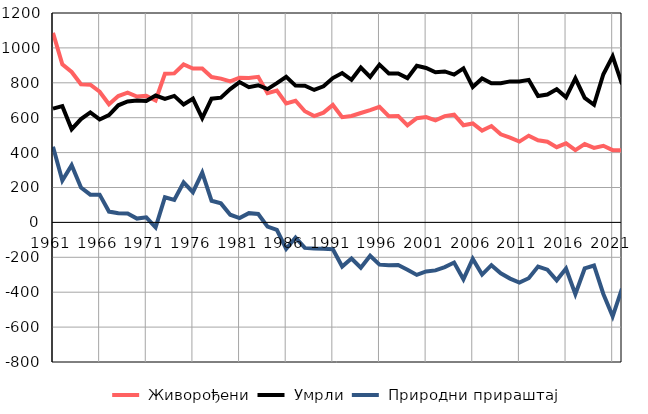
| Category |  Живорођени |  Умрли |  Природни прираштај |
|---|---|---|---|
| 1961.0 | 1086 | 652 | 434 |
| 1962.0 | 906 | 666 | 240 |
| 1963.0 | 862 | 534 | 328 |
| 1964.0 | 792 | 592 | 200 |
| 1965.0 | 789 | 630 | 159 |
| 1966.0 | 749 | 590 | 159 |
| 1967.0 | 677 | 615 | 62 |
| 1968.0 | 724 | 671 | 53 |
| 1969.0 | 744 | 693 | 51 |
| 1970.0 | 721 | 699 | 22 |
| 1971.0 | 725 | 696 | 29 |
| 1972.0 | 699 | 727 | -28 |
| 1973.0 | 852 | 708 | 144 |
| 1974.0 | 854 | 725 | 129 |
| 1975.0 | 905 | 676 | 229 |
| 1976.0 | 882 | 709 | 173 |
| 1977.0 | 882 | 597 | 285 |
| 1978.0 | 833 | 709 | 124 |
| 1979.0 | 824 | 715 | 109 |
| 1980.0 | 808 | 764 | 44 |
| 1981.0 | 829 | 804 | 25 |
| 1982.0 | 828 | 775 | 53 |
| 1983.0 | 834 | 786 | 48 |
| 1984.0 | 740 | 764 | -24 |
| 1985.0 | 755 | 798 | -43 |
| 1986.0 | 682 | 834 | -152 |
| 1987.0 | 697 | 784 | -87 |
| 1988.0 | 637 | 783 | -146 |
| 1989.0 | 609 | 759 | -150 |
| 1990.0 | 629 | 780 | -151 |
| 1991.0 | 673 | 827 | -154 |
| 1992.0 | 603 | 856 | -253 |
| 1993.0 | 610 | 817 | -207 |
| 1994.0 | 627 | 887 | -260 |
| 1995.0 | 643 | 834 | -191 |
| 1996.0 | 662 | 904 | -242 |
| 1997.0 | 609 | 854 | -245 |
| 1998.0 | 610 | 854 | -244 |
| 1999.0 | 556 | 827 | -271 |
| 2000.0 | 597 | 898 | -301 |
| 2001.0 | 604 | 885 | -281 |
| 2002.0 | 585 | 860 | -275 |
| 2003.0 | 609 | 865 | -256 |
| 2004.0 | 617 | 847 | -230 |
| 2005.0 | 557 | 883 | -326 |
| 2006.0 | 567 | 776 | -209 |
| 2007.0 | 526 | 825 | -299 |
| 2008.0 | 552 | 797 | -245 |
| 2009.0 | 505 | 797 | -292 |
| 2010.0 | 486 | 808 | -322 |
| 2011.0 | 463 | 808 | -345 |
| 2012.0 | 497 | 817 | -320 |
| 2013.0 | 471 | 724 | -253 |
| 2014.0 | 462 | 733 | -271 |
| 2015.0 | 431 | 763 | -332 |
| 2016.0 | 453 | 717 | -264 |
| 2017.0 | 414 | 825 | -411 |
| 2018.0 | 449 | 713 | -264 |
| 2019.0 | 427 | 674 | -247 |
| 2020.0 | 439 | 849 | -410 |
| 2021.0 | 414 | 952 | -538 |
| 2022.0 | 413 | 792 | -379 |